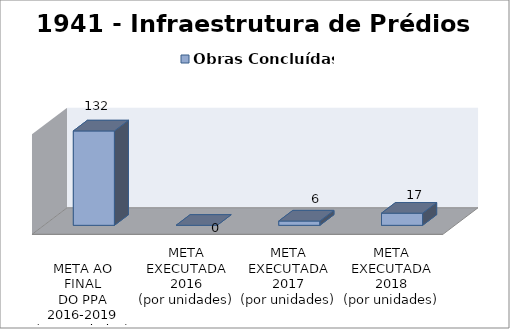
| Category | Obras Concluídas |
|---|---|
| 
META AO FINAL
DO PPA
2016-2019
(por unidades)
 | 132 |
| META EXECUTADA
2016
(por unidades) | 0 |
| META EXECUTADA
2017
(por unidades) | 6 |
| META EXECUTADA
2018
(por unidades) | 17 |